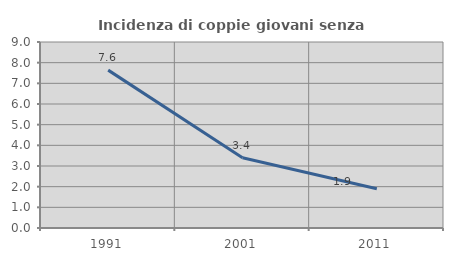
| Category | Incidenza di coppie giovani senza figli |
|---|---|
| 1991.0 | 7.639 |
| 2001.0 | 3.401 |
| 2011.0 | 1.899 |